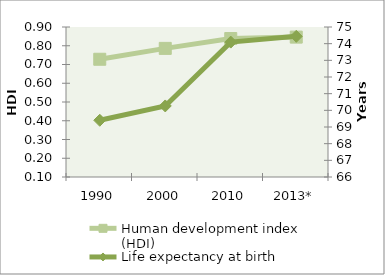
| Category | Human development index (HDI) |
|---|---|
| 1990 | 0.728 |
| 2000 | 0.786 |
| 2010 | 0.839 |
| 2013* | 0.846 |